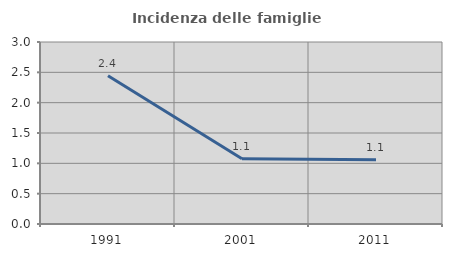
| Category | Incidenza delle famiglie numerose |
|---|---|
| 1991.0 | 2.445 |
| 2001.0 | 1.077 |
| 2011.0 | 1.058 |